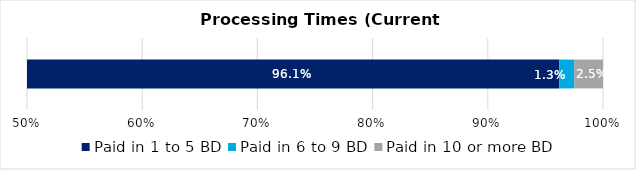
| Category | Paid in 1 to 5 BD | Paid in 6 to 9 BD | Paid in 10 or more BD |
|---|---|---|---|
| 0 | 0.961 | 0.013 | 0.025 |